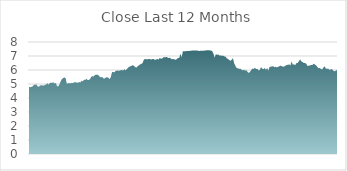
| Category | Series 0 |
|---|---|
| 2020-12-22 | 4.8 |
| 2020-12-23 | 4.77 |
| 2020-12-24 | 4.8 |
| 2020-12-29 | 4.83 |
| 2020-12-30 | 4.94 |
| 2020-12-31 | 4.95 |
| 2021-01-04 | 4.97 |
| 2021-01-05 | 4.84 |
| 2021-01-06 | 4.8 |
| 2021-01-07 | 4.89 |
| 2021-01-08 | 4.91 |
| 2021-01-11 | 4.9 |
| 2021-01-12 | 4.88 |
| 2021-01-13 | 4.94 |
| 2021-01-14 | 4.96 |
| 2021-01-15 | 5.06 |
| 2021-01-18 | 4.96 |
| 2021-01-19 | 5.07 |
| 2021-01-20 | 5.1 |
| 2021-01-21 | 5.08 |
| 2021-01-22 | 5.12 |
| 2021-01-25 | 5.03 |
| 2021-01-27 | 5.08 |
| 2021-01-28 | 4.83 |
| 2021-01-29 | 4.84 |
| 2021-02-01 | 4.99 |
| 2021-02-02 | 5.2 |
| 2021-02-03 | 5.36 |
| 2021-02-04 | 5.42 |
| 2021-02-05 | 5.47 |
| 2021-02-08 | 5.41 |
| 2021-02-09 | 5.01 |
| 2021-02-10 | 5.06 |
| 2021-02-11 | 5.07 |
| 2021-02-12 | 5.04 |
| 2021-02-15 | 5.09 |
| 2021-02-16 | 5.06 |
| 2021-02-17 | 5.12 |
| 2021-02-18 | 5.12 |
| 2021-02-19 | 5.11 |
| 2021-02-22 | 5.08 |
| 2021-02-23 | 5.15 |
| 2021-02-24 | 5.11 |
| 2021-02-25 | 5.24 |
| 2021-02-26 | 5.18 |
| 2021-03-01 | 5.3 |
| 2021-03-02 | 5.29 |
| 2021-03-03 | 5.37 |
| 2021-03-04 | 5.29 |
| 2021-03-05 | 5.28 |
| 2021-03-08 | 5.36 |
| 2021-03-09 | 5.52 |
| 2021-03-10 | 5.56 |
| 2021-03-11 | 5.53 |
| 2021-03-12 | 5.65 |
| 2021-03-15 | 5.66 |
| 2021-03-16 | 5.67 |
| 2021-03-17 | 5.62 |
| 2021-03-18 | 5.5 |
| 2021-03-19 | 5.48 |
| 2021-03-22 | 5.5 |
| 2021-03-23 | 5.4 |
| 2021-03-24 | 5.4 |
| 2021-03-25 | 5.47 |
| 2021-03-26 | 5.49 |
| 2021-03-29 | 5.44 |
| 2021-03-30 | 5.35 |
| 2021-03-31 | 5.49 |
| 2021-04-01 | 5.86 |
| 2021-04-06 | 5.85 |
| 2021-04-07 | 5.83 |
| 2021-04-08 | 5.94 |
| 2021-04-09 | 5.96 |
| 2021-04-12 | 5.95 |
| 2021-04-13 | 5.95 |
| 2021-04-14 | 5.98 |
| 2021-04-15 | 6.01 |
| 2021-04-16 | 5.95 |
| 2021-04-19 | 6.06 |
| 2021-04-20 | 5.98 |
| 2021-04-21 | 6.05 |
| 2021-04-22 | 6.15 |
| 2021-04-23 | 6.23 |
| 2021-04-26 | 6.26 |
| 2021-04-27 | 6.3 |
| 2021-04-28 | 6.35 |
| 2021-04-29 | 6.28 |
| 2021-04-30 | 6.2 |
| 2021-05-03 | 6.17 |
| 2021-05-04 | 6.28 |
| 2021-05-05 | 6.33 |
| 2021-05-06 | 6.4 |
| 2021-05-07 | 6.44 |
| 2021-05-10 | 6.5 |
| 2021-05-11 | 6.72 |
| 2021-05-12 | 6.8 |
| 2021-05-13 | 6.76 |
| 2021-05-14 | 6.77 |
| 2021-05-17 | 6.78 |
| 2021-05-18 | 6.79 |
| 2021-05-19 | 6.75 |
| 2021-05-20 | 6.78 |
| 2021-05-21 | 6.78 |
| 2021-05-24 | 6.73 |
| 2021-05-25 | 6.74 |
| 2021-05-26 | 6.8 |
| 2021-05-27 | 6.74 |
| 2021-05-28 | 6.86 |
| 2021-05-31 | 6.81 |
| 2021-06-01 | 6.82 |
| 2021-06-02 | 6.91 |
| 2021-06-03 | 6.91 |
| 2021-06-04 | 6.92 |
| 2021-06-07 | 6.92 |
| 2021-06-08 | 6.85 |
| 2021-06-09 | 6.88 |
| 2021-06-10 | 6.83 |
| 2021-06-11 | 6.76 |
| 2021-06-15 | 6.79 |
| 2021-06-16 | 6.76 |
| 2021-06-17 | 6.73 |
| 2021-06-18 | 6.78 |
| 2021-06-21 | 6.87 |
| 2021-06-22 | 6.85 |
| 2021-06-23 | 7.16 |
| 2021-06-24 | 6.9 |
| 2021-06-25 | 7.34 |
| 2021-06-28 | 7.34 |
| 2021-06-29 | 7.34 |
| 2021-06-30 | 7.35 |
| 2021-07-01 | 7.36 |
| 2021-07-02 | 7.36 |
| 2021-07-05 | 7.37 |
| 2021-07-06 | 7.38 |
| 2021-07-07 | 7.4 |
| 2021-07-08 | 7.39 |
| 2021-07-09 | 7.39 |
| 2021-07-12 | 7.39 |
| 2021-07-13 | 7.39 |
| 2021-07-14 | 7.35 |
| 2021-07-15 | 7.38 |
| 2021-07-16 | 7.38 |
| 2021-07-19 | 7.38 |
| 2021-07-20 | 7.38 |
| 2021-07-21 | 7.4 |
| 2021-07-22 | 7.4 |
| 2021-07-23 | 7.41 |
| 2021-07-26 | 7.41 |
| 2021-07-27 | 7.4 |
| 2021-07-28 | 7.4 |
| 2021-07-29 | 7.34 |
| 2021-07-30 | 7.18 |
| 2021-08-02 | 6.88 |
| 2021-08-03 | 7.13 |
| 2021-08-04 | 7.08 |
| 2021-08-05 | 7.11 |
| 2021-08-06 | 7.03 |
| 2021-08-09 | 7.04 |
| 2021-08-10 | 7.01 |
| 2021-08-11 | 7.02 |
| 2021-08-12 | 6.97 |
| 2021-08-13 | 6.95 |
| 2021-08-16 | 6.83 |
| 2021-08-17 | 6.79 |
| 2021-08-18 | 6.71 |
| 2021-08-19 | 6.66 |
| 2021-08-20 | 6.73 |
| 2021-08-23 | 6.85 |
| 2021-08-24 | 6.47 |
| 2021-08-25 | 6.3 |
| 2021-08-26 | 6.14 |
| 2021-08-27 | 6.12 |
| 2021-08-30 | 6.09 |
| 2021-08-31 | 6.1 |
| 2021-09-01 | 6.02 |
| 2021-09-02 | 5.97 |
| 2021-09-03 | 6.03 |
| 2021-09-06 | 5.95 |
| 2021-09-07 | 5.99 |
| 2021-09-08 | 5.86 |
| 2021-09-09 | 5.79 |
| 2021-09-10 | 5.87 |
| 2021-09-13 | 6 |
| 2021-09-14 | 6.11 |
| 2021-09-15 | 6.07 |
| 2021-09-16 | 6.16 |
| 2021-09-17 | 6.07 |
| 2021-09-20 | 6.09 |
| 2021-09-21 | 5.97 |
| 2021-09-22 | 6.01 |
| 2021-09-23 | 6.21 |
| 2021-09-24 | 6.09 |
| 2021-09-27 | 6.06 |
| 2021-09-28 | 6.15 |
| 2021-09-29 | 6.01 |
| 2021-09-30 | 6.14 |
| 2021-10-01 | 5.97 |
| 2021-10-04 | 6.22 |
| 2021-10-05 | 6.24 |
| 2021-10-06 | 6.25 |
| 2021-10-07 | 6.28 |
| 2021-10-08 | 6.19 |
| 2021-10-11 | 6.24 |
| 2021-10-12 | 6.18 |
| 2021-10-13 | 6.23 |
| 2021-10-14 | 6.27 |
| 2021-10-15 | 6.31 |
| 2021-10-18 | 6.27 |
| 2021-10-19 | 6.24 |
| 2021-10-20 | 6.25 |
| 2021-10-21 | 6.31 |
| 2021-10-22 | 6.36 |
| 2021-10-25 | 6.37 |
| 2021-10-26 | 6.4 |
| 2021-10-27 | 6.32 |
| 2021-10-28 | 6.61 |
| 2021-10-29 | 6.38 |
| 2021-11-01 | 6.41 |
| 2021-11-02 | 6.34 |
| 2021-11-03 | 6.5 |
| 2021-11-04 | 6.5 |
| 2021-11-05 | 6.63 |
| 2021-11-08 | 6.76 |
| 2021-11-09 | 6.61 |
| 2021-11-10 | 6.57 |
| 2021-11-11 | 6.5 |
| 2021-11-12 | 6.5 |
| 2021-11-15 | 6.45 |
| 2021-11-16 | 6.29 |
| 2021-11-17 | 6.3 |
| 2021-11-18 | 6.33 |
| 2021-11-19 | 6.36 |
| 2021-11-22 | 6.36 |
| 2021-11-23 | 6.45 |
| 2021-11-24 | 6.4 |
| 2021-11-25 | 6.33 |
| 2021-11-26 | 6.23 |
| 2021-11-29 | 6.12 |
| 2021-11-30 | 6.15 |
| 2021-12-01 | 6.08 |
| 2021-12-02 | 6.04 |
| 2021-12-03 | 6.17 |
| 2021-12-06 | 6.27 |
| 2021-12-07 | 6.11 |
| 2021-12-08 | 6.09 |
| 2021-12-09 | 6.1 |
| 2021-12-10 | 6.02 |
| 2021-12-13 | 6.03 |
| 2021-12-14 | 6.08 |
| 2021-12-15 | 5.96 |
| 2021-12-16 | 5.91 |
| 2021-12-17 | 5.94 |
| 2021-12-20 | 6 |
| 2021-12-21 | 6.02 |